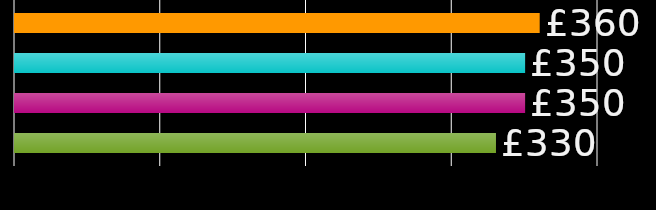
| Category | housemate 1 | housemate 2 | housemate 3 | housemate 4 |
|---|---|---|---|---|
| 0 | 360 | 350 | 350 | 330 |